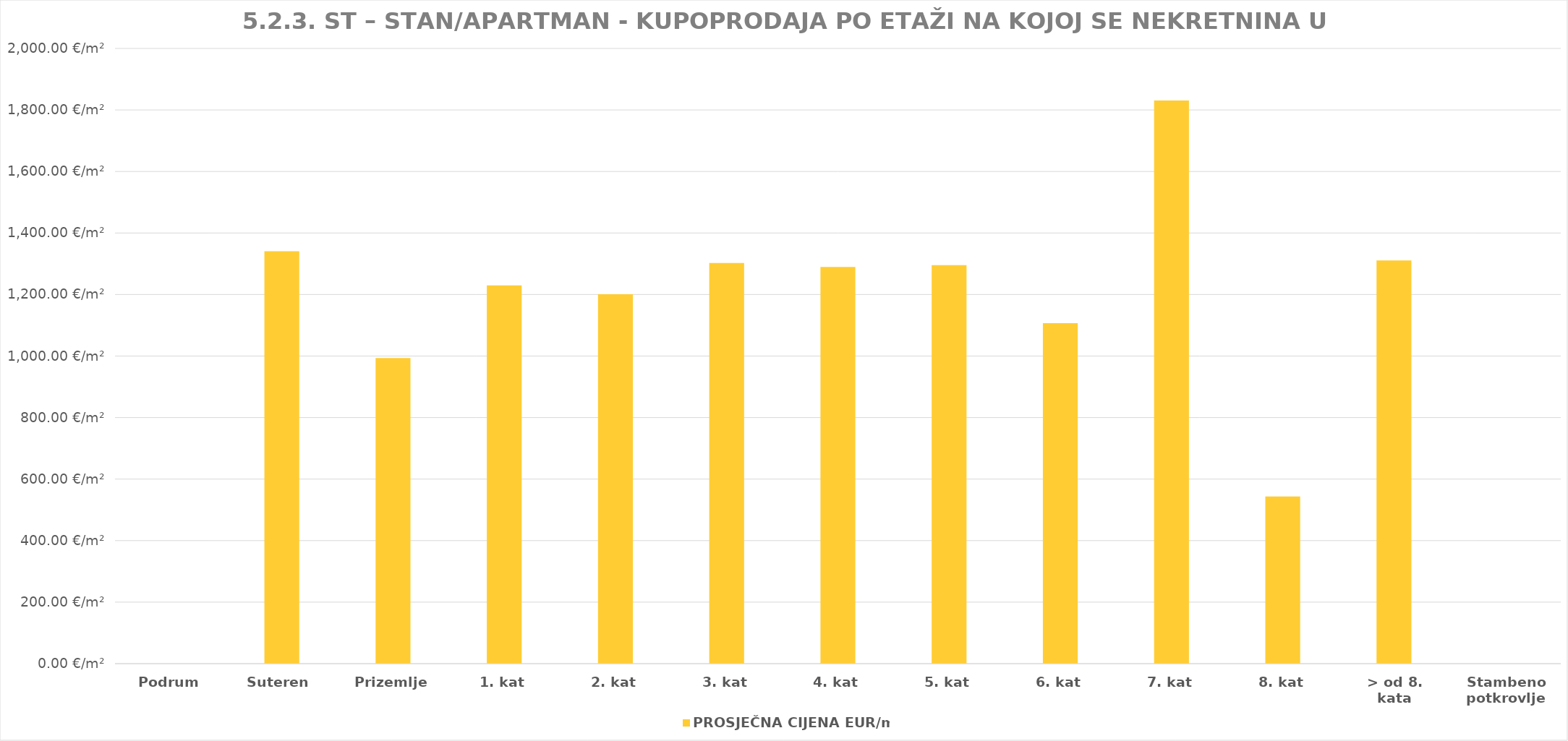
| Category | PROSJEČNA CIJENA EUR/m2 |
|---|---|
| Podrum | 0 |
| Suteren  | 1903-09-02 01:37:23 |
| Prizemlje | 1902-09-19 17:24:02 |
| 1. kat | 1903-05-13 17:50:10 |
| 2. kat | 1903-04-14 17:48:09 |
| 3. kat | 1903-07-25 07:00:18 |
| 4. kat | 1903-07-12 18:55:24 |
| 5. kat | 1903-07-18 15:03:30 |
| 6. kat | 1903-01-10 18:24:31 |
| 7. kat | 1905-01-04 01:20:12 |
| 8. kat | 1901-06-26 17:25:02 |
| > od 8. kata | 1903-08-02 15:35:29 |
| Stambeno potkrovlje | 0 |